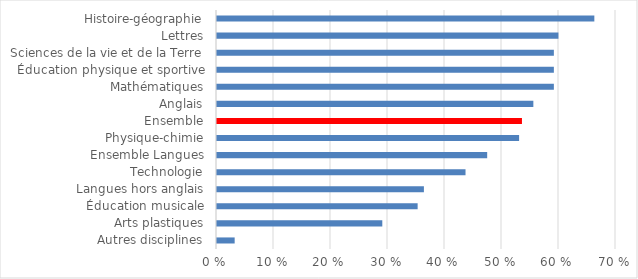
| Category | Part des professeurs principaux |
|---|---|
| Autres disciplines | 0.031 |
| Arts plastiques | 0.29 |
| Éducation musicale | 0.352 |
| Langues hors anglais | 0.363 |
| Technologie | 0.436 |
| Ensemble Langues | 0.474 |
| Physique-chimie | 0.53 |
| Ensemble | 0.535 |
| Anglais | 0.555 |
| Mathématiques | 0.591 |
| Éducation physique et sportive | 0.591 |
| Sciences de la vie et de la Terre | 0.591 |
| Lettres | 0.599 |
| Histoire-géographie | 0.662 |